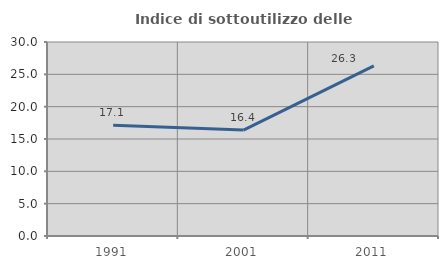
| Category | Indice di sottoutilizzo delle abitazioni  |
|---|---|
| 1991.0 | 17.121 |
| 2001.0 | 16.379 |
| 2011.0 | 26.316 |